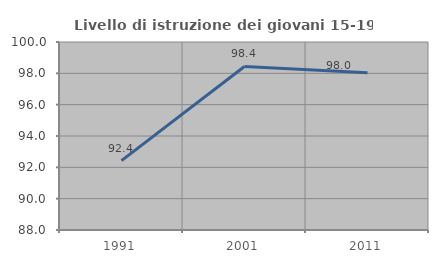
| Category | Livello di istruzione dei giovani 15-19 anni |
|---|---|
| 1991.0 | 92.429 |
| 2001.0 | 98.438 |
| 2011.0 | 98.039 |